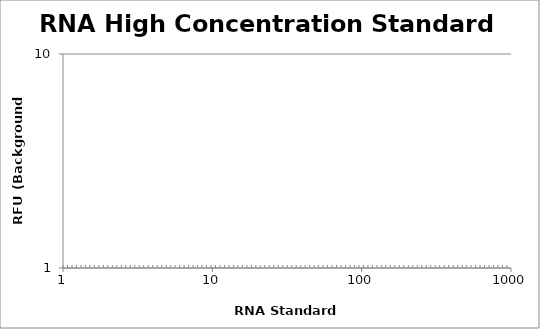
| Category | Average |
|---|---|
| 500.0 | 0 |
| 250.0 | 0 |
| 125.0 | 0 |
| 62.5 | 0 |
| 31.25 | 0 |
| 15.625 | 0 |
| 7.8125 | 0 |